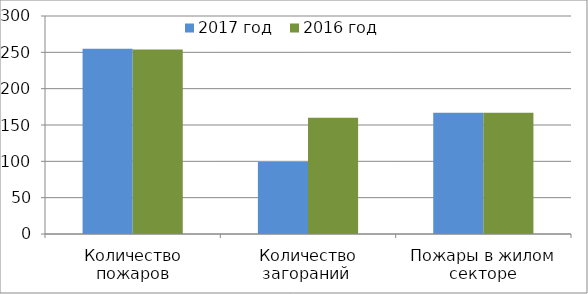
| Category | 2017 год | 2016 год |
|---|---|---|
| Количество пожаров | 255 | 254 |
| Количество загораний  | 99 | 160 |
| Пожары в жилом секторе | 167 | 167 |